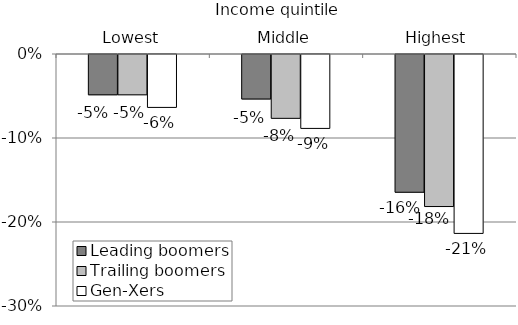
| Category | Leading boomers | Trailing boomers | Gen-Xers |
|---|---|---|---|
| Lowest | -0.048 | -0.048 | -0.063 |
| Middle | -0.053 | -0.076 | -0.088 |
| Highest | -0.164 | -0.181 | -0.213 |